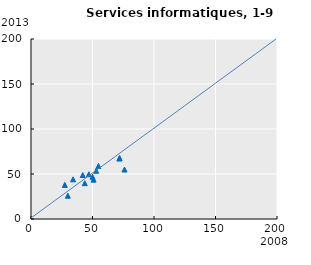
| Category | Series 0 |
|---|---|
| 42.061304784408584 | 48.835 |
| 50.86337703179496 | 43.748 |
| 43.71280105617359 | 39.815 |
| 50.058137649871654 | 46.87 |
| 71.88667289220918 | 67.14 |
| 52.98550714026726 | 53.589 |
| 34.20489167001882 | 44.096 |
| 54.817983295024256 | 58.915 |
| 27.46952613002371 | 37.865 |
| 47.04336855165312 | 49.736 |
| 72.02141252717996 | 67.761 |
| 29.95252500507982 | 25.885 |
| 76.03725107245124 | 54.981 |